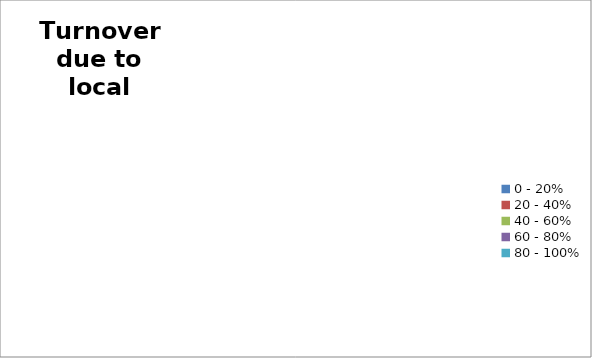
| Category | Series 0 |
|---|---|
| 0 - 20% | 0 |
| 20 - 40% | 0 |
| 40 - 60% | 0 |
| 60 - 80% | 0 |
| 80 - 100% | 0 |